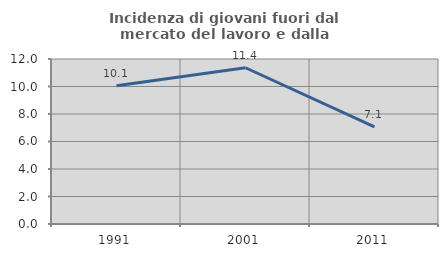
| Category | Incidenza di giovani fuori dal mercato del lavoro e dalla formazione  |
|---|---|
| 1991.0 | 10.06 |
| 2001.0 | 11.364 |
| 2011.0 | 7.071 |